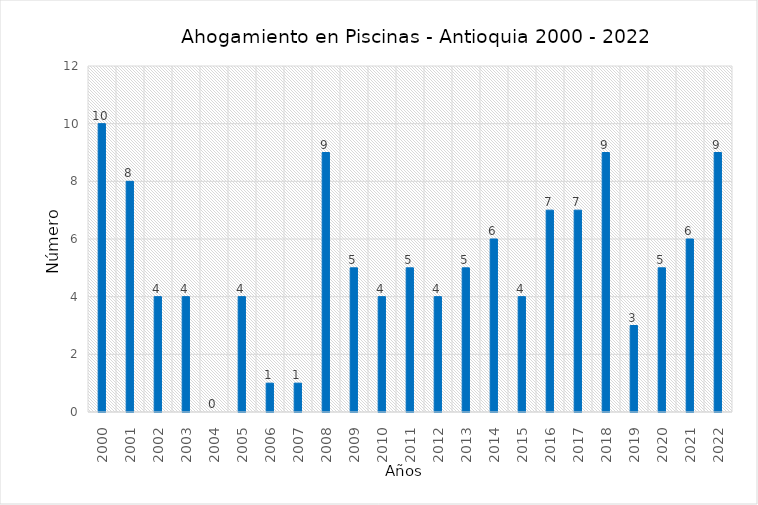
| Category | Total |
|---|---|
| 2000 | 10 |
| 2001 | 8 |
| 2002 | 4 |
| 2003 | 4 |
| 2004 | 0 |
| 2005 | 4 |
| 2006 | 1 |
| 2007 | 1 |
| 2008 | 9 |
| 2009 | 5 |
| 2010 | 4 |
| 2011 | 5 |
| 2012 | 4 |
| 2013 | 5 |
| 2014 | 6 |
| 2015 | 4 |
| 2016 | 7 |
| 2017 | 7 |
| 2018 | 9 |
| 2019 | 3 |
| 2020 | 5 |
| 2021 | 6 |
| 2022 | 9 |